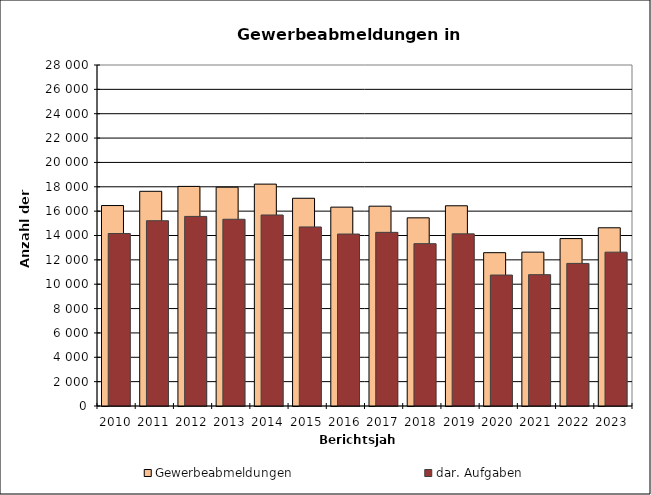
| Category | Gewerbeabmeldungen | dar. Aufgaben |
|---|---|---|
| 2010.0 | 16460 | 14163 |
| 2011.0 | 17629 | 15213 |
| 2012.0 | 18032 | 15567 |
| 2013.0 | 17968 | 15333 |
| 2014.0 | 18219 | 15684 |
| 2015.0 | 17058 | 14703 |
| 2016.0 | 16329 | 14120 |
| 2017.0 | 16407 | 14259 |
| 2018.0 | 15450 | 13328 |
| 2019.0 | 16441 | 14135 |
| 2020.0 | 12589 | 10752 |
| 2021.0 | 12634 | 10784 |
| 2022.0 | 13748 | 11708 |
| 2023.0 | 14635 | 12632 |